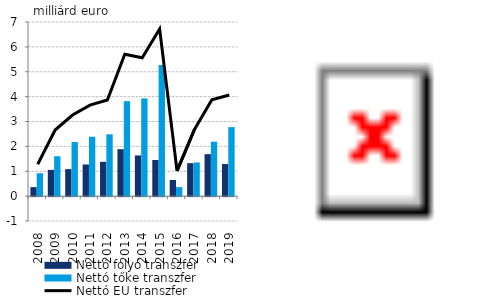
| Category | Nettó folyó transzfer | Nettó tőke transzfer |
|---|---|---|
| 2008.0 | 0.362 | 0.921 |
| 2009.0 | 1.055 | 1.603 |
| 2010.0 | 1.085 | 2.174 |
| 2011.0 | 1.273 | 2.387 |
| 2012.0 | 1.378 | 2.484 |
| 2013.0 | 1.887 | 3.817 |
| 2014.0 | 1.635 | 3.928 |
| 2015.0 | 1.452 | 5.271 |
| 2016.0 | 0.65 | 0.363 |
| 2017.0 | 1.325 | 1.353 |
| 2018.0 | 1.687 | 2.188 |
| 2019.0 | 1.29 | 2.773 |